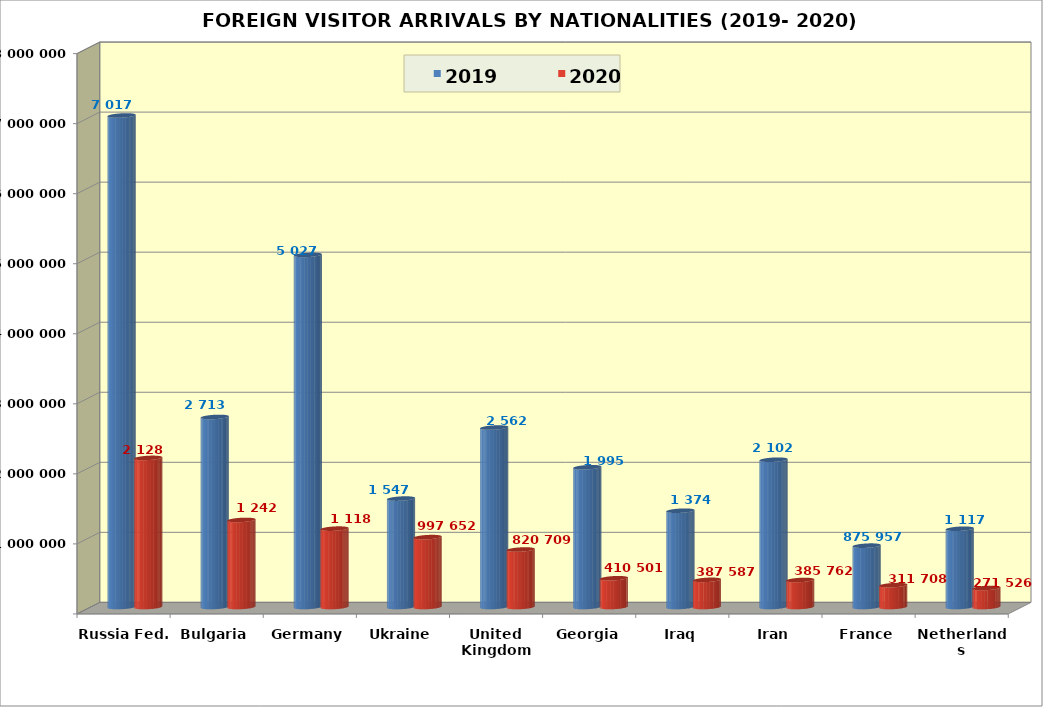
| Category | 2019 | 2020 |
|---|---|---|
| Russia Fed. | 7017657 | 2128758 |
| Bulgaria | 2713464 | 1242961 |
| Germany | 5027472 | 1118932 |
| Ukraine | 1547996 | 997652 |
| United Kingdom (UK) | 2562064 | 820709 |
| Georgia | 1995254 | 410501 |
| Iraq | 1374896 | 387587 |
| Iran | 2102890 | 385762 |
| France | 875957 | 311708 |
| Netherlands | 1117290 | 271526 |